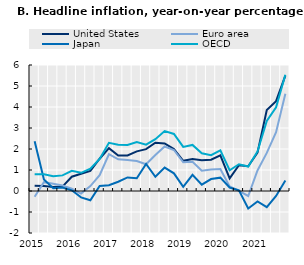
| Category | United States | Euro area | Japan | OECD |
|---|---|---|---|---|
| 2015 | 0.252 | -0.277 | 2.368 | 0.801 |
|  | 0.236 | 0.42 | 0.545 | 0.799 |
|  | 0.195 | 0.34 | 0.136 | 0.705 |
|  | 0.211 | 0.259 | 0.17 | 0.743 |
| 2016 | 0.681 | 0.106 | 0.034 | 0.961 |
|  | 0.824 | -0.123 | -0.305 | 0.866 |
|  | 0.958 | 0.232 | -0.441 | 1.06 |
|  | 1.536 | 0.753 | 0.238 | 1.524 |
| 2017 | 2.041 | 1.751 | 0.272 | 2.292 |
|  | 1.691 | 1.508 | 0.442 | 2.204 |
|  | 1.689 | 1.471 | 0.647 | 2.189 |
|  | 1.887 | 1.424 | 0.61 | 2.335 |
| 2018 | 1.995 | 1.272 | 1.289 | 2.21 |
|  | 2.301 | 1.71 | 0.677 | 2.465 |
|  | 2.262 | 2.121 | 1.116 | 2.852 |
|  | 1.995 | 1.953 | 0.842 | 2.717 |
| 2019 | 1.436 | 1.372 | 0.201 | 2.099 |
|  | 1.528 | 1.393 | 0.773 | 2.193 |
|  | 1.469 | 0.967 | 0.301 | 1.797 |
|  | 1.487 | 1.024 | 0.568 | 1.708 |
| 2020 | 1.695 | 1.048 | 0.635 | 1.94 |
|  | 0.599 | 0.218 | 0.167 | 0.988 |
|  | 1.229 | 0.005 | 0.033 | 1.273 |
|  | 1.18 | -0.237 | -0.83 | 1.165 |
| 2021 | 1.824 | 0.977 | -0.498 | 1.884 |